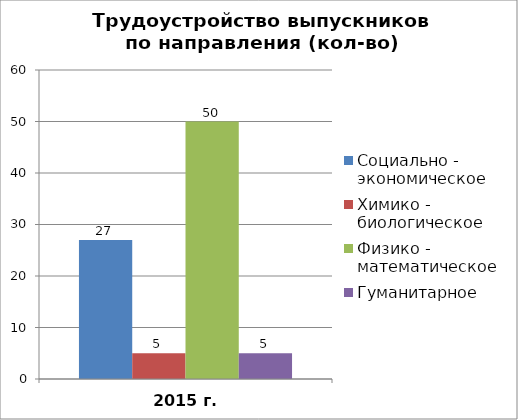
| Category | Социально - экономическое | Химико - биологическое | Физико - математическое | Гуманитарное |
|---|---|---|---|---|
| 2015 г. | 27 | 5 | 50 | 5 |